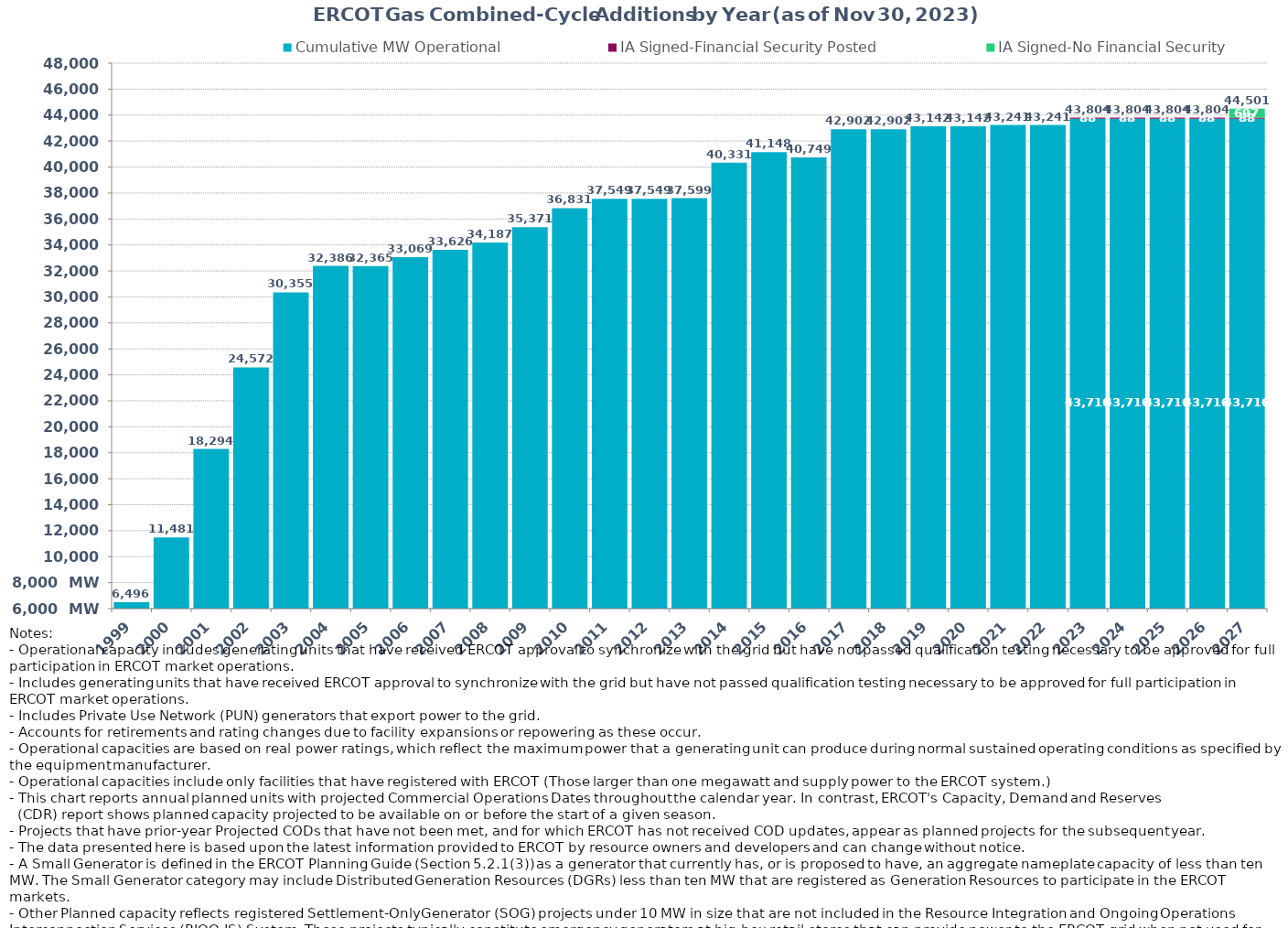
| Category | Cumulative MW Operational | IA Signed-Financial Security Posted  | IA Signed-No Financial Security  | Other Planned | Cumulative Installed and Planned |
|---|---|---|---|---|---|
| 1999.0 | 6496.189 | 0 | 0 | 0 | 6496.189 |
| 2000.0 | 11480.519 | 0 | 0 | 0 | 11480.519 |
| 2001.0 | 18293.659 | 0 | 0 | 0 | 18293.659 |
| 2002.0 | 24571.899 | 0 | 0 | 0 | 24571.899 |
| 2003.0 | 30354.999 | 0 | 0 | 0 | 30354.999 |
| 2004.0 | 32385.519 | 0 | 0 | 0 | 32385.519 |
| 2005.0 | 32364.619 | 0 | 0 | 0 | 32364.619 |
| 2006.0 | 33068.819 | 0 | 0 | 0 | 33068.819 |
| 2007.0 | 33626.119 | 0 | 0 | 0 | 33626.119 |
| 2008.0 | 34187.219 | 0 | 0 | 0 | 34187.219 |
| 2009.0 | 35370.599 | 0 | 0 | 0 | 35370.599 |
| 2010.0 | 36830.799 | 0 | 0 | 0 | 36830.799 |
| 2011.0 | 37549.199 | 0 | 0 | 0 | 37549.199 |
| 2012.0 | 37549.199 | 0 | 0 | 0 | 37549.199 |
| 2013.0 | 37599.199 | 0 | 0 | 0 | 37599.199 |
| 2014.0 | 40330.999 | 0 | 0 | 0 | 40330.999 |
| 2015.0 | 41148.099 | 0 | 0 | 0 | 41148.099 |
| 2016.0 | 40749.109 | 0 | 0 | 0 | 40749.109 |
| 2017.0 | 42901.609 | 0 | 0 | 0 | 42901.609 |
| 2018.0 | 42901.609 | 0 | 0 | 0 | 42901.609 |
| 2019.0 | 43142.009 | 0 | 0 | 0 | 43142.009 |
| 2020.0 | 43142.009 | 0 | 0 | 0 | 43142.009 |
| 2021.0 | 43240.909 | 0 | 0 | 0 | 43240.909 |
| 2022.0 | 43240.909 | 0 | 0 | 0 | 43240.909 |
| 2023.0 | 43715.709 | 88 | 0 | 0 | 43803.709 |
| 2024.0 | 43715.709 | 88 | 0 | 0 | 43803.709 |
| 2025.0 | 43715.709 | 88 | 0 | 0 | 43803.709 |
| 2026.0 | 43715.709 | 88 | 0 | 0 | 43803.709 |
| 2027.0 | 43715.709 | 88 | 697 | 0 | 44500.709 |